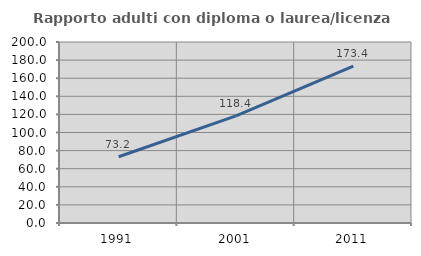
| Category | Rapporto adulti con diploma o laurea/licenza media  |
|---|---|
| 1991.0 | 73.249 |
| 2001.0 | 118.41 |
| 2011.0 | 173.407 |